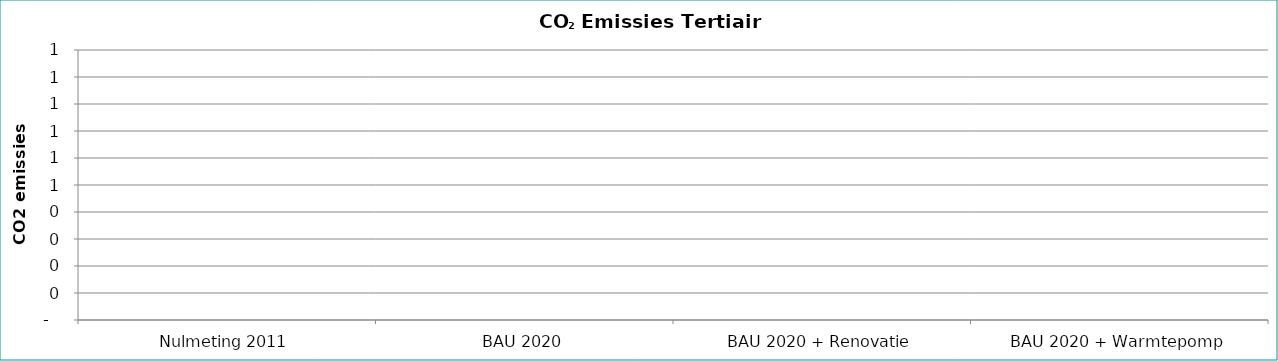
| Category | Emissies CO2 in 2020 [ton] volgens … |
|---|---|
| Nulmeting 2011 | 0 |
| BAU 2020 | 0 |
| BAU 2020 + Renovatie | 0 |
| BAU 2020 + Warmtepomp | 0 |